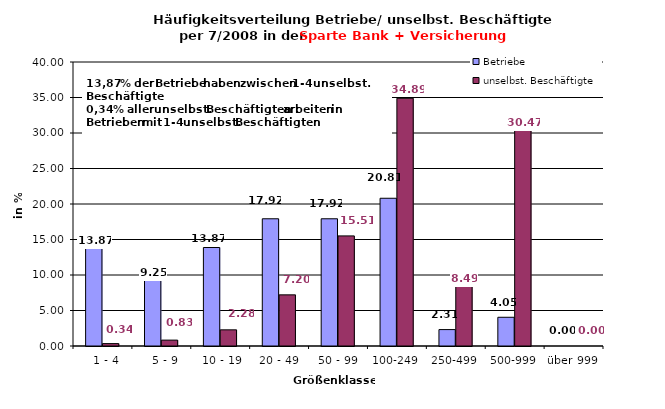
| Category | Betriebe | unselbst. Beschäftigte |
|---|---|---|
|   1 - 4 | 13.873 | 0.337 |
|   5 - 9 | 9.249 | 0.829 |
|  10 - 19 | 13.873 | 2.277 |
| 20 - 49 | 17.919 | 7.202 |
| 50 - 99 | 17.919 | 15.507 |
| 100-249 | 20.809 | 34.893 |
| 250-499 | 2.312 | 8.488 |
| 500-999 | 4.046 | 30.467 |
| über 999 | 0 | 0 |